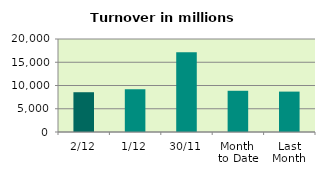
| Category | Series 0 |
|---|---|
| 2/12 | 8554.048 |
| 1/12 | 9174.349 |
| 30/11 | 17146.844 |
| Month 
to Date | 8864.199 |
| Last
Month | 8686.894 |